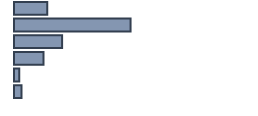
| Category | Percentatge |
|---|---|
| 0 | 13.87 |
| 1 | 48.565 |
| 2 | 20.043 |
| 3 | 12.261 |
| 4 | 2.174 |
| 5 | 3.087 |